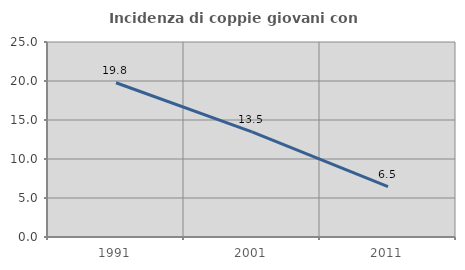
| Category | Incidenza di coppie giovani con figli |
|---|---|
| 1991.0 | 19.776 |
| 2001.0 | 13.487 |
| 2011.0 | 6.463 |